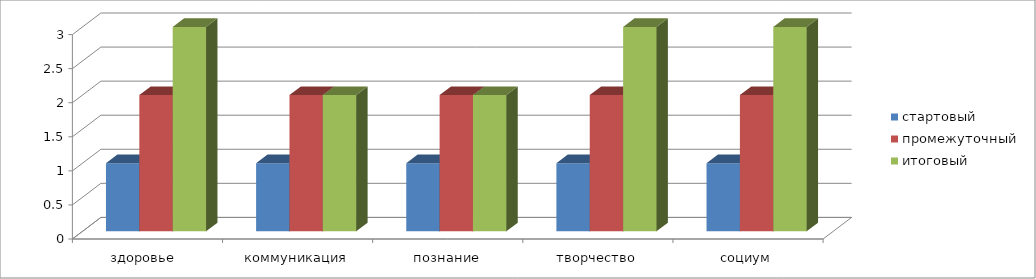
| Category | стартовый | промежуточный | итоговый |
|---|---|---|---|
| здоровье  | 1 | 2 | 3 |
| коммуникация | 1 | 2 | 2 |
| познание | 1 | 2 | 2 |
| творчество | 1 | 2 | 3 |
| социум | 1 | 2 | 3 |